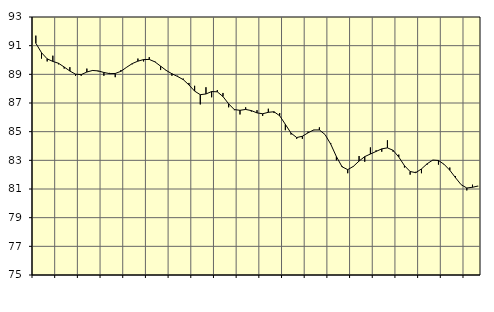
| Category | Piggar | Series 1 |
|---|---|---|
| nan | 91.7 | 91.17 |
| 1.0 | 90.1 | 90.51 |
| 1.0 | 89.9 | 90.08 |
| 1.0 | 90.3 | 89.9 |
| nan | 89.7 | 89.77 |
| 2.0 | 89.4 | 89.51 |
| 2.0 | 89.5 | 89.23 |
| 2.0 | 88.9 | 89.01 |
| nan | 88.9 | 88.98 |
| 3.0 | 89.4 | 89.16 |
| 3.0 | 89.3 | 89.27 |
| 3.0 | 89.2 | 89.24 |
| nan | 88.9 | 89.13 |
| 4.0 | 89.1 | 89.05 |
| 4.0 | 88.8 | 89.06 |
| 4.0 | 89.3 | 89.21 |
| nan | 89.5 | 89.49 |
| 5.0 | 89.7 | 89.75 |
| 5.0 | 90.1 | 89.92 |
| 5.0 | 89.9 | 90.03 |
| nan | 90.2 | 90.04 |
| 6.0 | 89.9 | 89.87 |
| 6.0 | 89.3 | 89.57 |
| 6.0 | 89.3 | 89.27 |
| nan | 88.9 | 89.04 |
| 7.0 | 88.9 | 88.85 |
| 7.0 | 88.7 | 88.63 |
| 7.0 | 88.4 | 88.26 |
| nan | 88.2 | 87.83 |
| 8.0 | 86.9 | 87.58 |
| 8.0 | 88.1 | 87.63 |
| 8.0 | 87.4 | 87.8 |
| nan | 87.9 | 87.78 |
| 9.0 | 87.7 | 87.45 |
| 9.0 | 86.7 | 86.94 |
| 9.0 | 86.5 | 86.54 |
| nan | 86.2 | 86.49 |
| 10.0 | 86.7 | 86.55 |
| 10.0 | 86.4 | 86.47 |
| 10.0 | 86.5 | 86.31 |
| nan | 86.1 | 86.25 |
| 11.0 | 86.6 | 86.35 |
| 11.0 | 86.3 | 86.39 |
| 11.0 | 86.3 | 86.11 |
| nan | 85.1 | 85.51 |
| 12.0 | 84.8 | 84.9 |
| 12.0 | 84.5 | 84.59 |
| 12.0 | 84.5 | 84.68 |
| nan | 85 | 84.92 |
| 13.0 | 85.1 | 85.12 |
| 13.0 | 85.3 | 85.12 |
| 13.0 | 84.8 | 84.8 |
| nan | 84.2 | 84.13 |
| 14.0 | 83 | 83.26 |
| 14.0 | 82.6 | 82.55 |
| 14.0 | 82.1 | 82.35 |
| nan | 82.6 | 82.58 |
| 15.0 | 83.3 | 82.95 |
| 15.0 | 82.9 | 83.26 |
| 15.0 | 83.9 | 83.44 |
| nan | 83.7 | 83.62 |
| 16.0 | 83.6 | 83.8 |
| 16.0 | 84.4 | 83.87 |
| 16.0 | 83.6 | 83.7 |
| nan | 83.4 | 83.23 |
| 17.0 | 82.5 | 82.63 |
| 17.0 | 82 | 82.22 |
| 17.0 | 82.2 | 82.14 |
| nan | 82.1 | 82.4 |
| 18.0 | 82.7 | 82.76 |
| 18.0 | 83 | 83.02 |
| 18.0 | 82.7 | 82.99 |
| nan | 82.7 | 82.72 |
| 19.0 | 82.5 | 82.31 |
| 19.0 | 81.9 | 81.79 |
| 19.0 | 81.3 | 81.3 |
| nan | 80.9 | 81.07 |
| 20.0 | 81.3 | 81.12 |
| 20.0 | 81.2 | 81.21 |